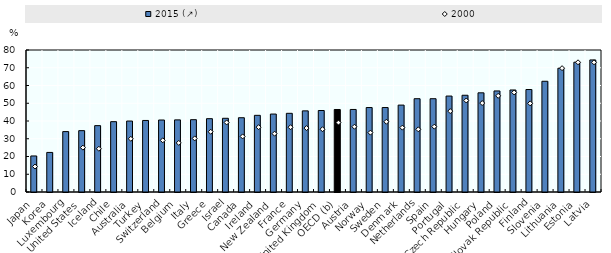
| Category | 2015 (↗) |
|---|---|
| Japan | 20.3 |
| Korea | 22.29 |
| Luxembourg | 34.04 |
| United States | 34.56 |
| Iceland | 37.39 |
| Chile | 39.63 |
| Australia | 39.98 |
| Turkey | 40.3 |
| Switzerland | 40.56 |
| Belgium | 40.63 |
| Italy | 40.74 |
| Greece | 41.31 |
| Israel | 41.53 |
| Canada | 41.84 |
| Ireland | 43.19 |
| New Zealand | 43.91 |
| France | 44.33 |
| Germany | 45.71 |
| United Kingdom | 45.91 |
| OECD (b) | 46.482 |
| Austria | 46.5 |
| Norway | 47.58 |
| Sweden | 47.58 |
| Denmark | 48.96 |
| Netherlands | 52.56 |
| Spain | 52.56 |
| Portugal | 54.05 |
| Czech Republic | 54.5 |
| Hungary | 55.88 |
| Poland | 56.93 |
| Slovak Republic | 57.48 |
| Finland | 57.73 |
| Slovenia | 62.38 |
| Lithuania | 69.72 |
| Estonia | 73.13 |
| Latvia | 74.41 |